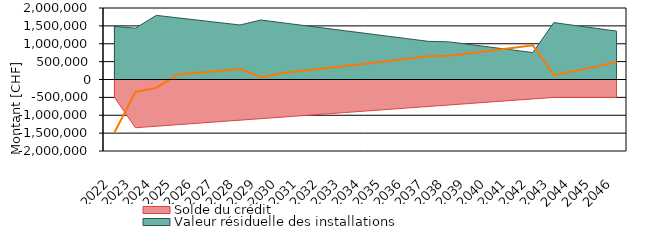
| Category | Cash-flow cumulé |
|---|---|
| 2022.0 | -1481800 |
| 2023.0 | -348331.489 |
| 2024.0 | -235562.573 |
| 2025.0 | 137775.998 |
| 2026.0 | 188293.582 |
| 2027.0 | 240002.224 |
| 2028.0 | 292905.013 |
| 2029.0 | 62608.412 |
| 2030.0 | 182694.109 |
| 2031.0 | 245692.358 |
| 2032.0 | 309889.941 |
| 2033.0 | 375290.102 |
| 2034.0 | 441896.082 |
| 2035.0 | 509711.121 |
| 2036.0 | 578738.455 |
| 2037.0 | 648981.32 |
| 2038.0 | 661170.4 |
| 2039.0 | 733854.027 |
| 2040.0 | 807762.882 |
| 2041.0 | 882900.194 |
| 2042.0 | 959269.19 |
| 2043.0 | 119809.767 |
| 2044.0 | 239876.809 |
| 2045.0 | 359910.21 |
| 2046.0 | 479913.193 |